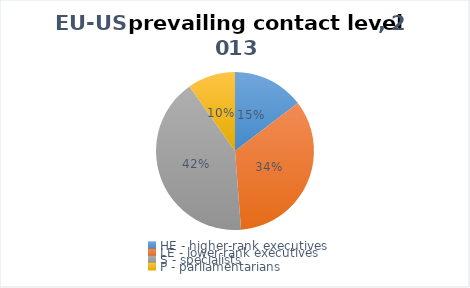
| Category | 2013 |
|---|---|
| HE - higher-rank executives | 6 |
| LE - lower-rank executives | 14 |
| S - specialists | 17 |
| P - parliamentarians | 4 |